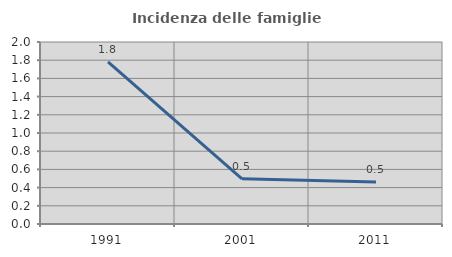
| Category | Incidenza delle famiglie numerose |
|---|---|
| 1991.0 | 1.782 |
| 2001.0 | 0.497 |
| 2011.0 | 0.462 |